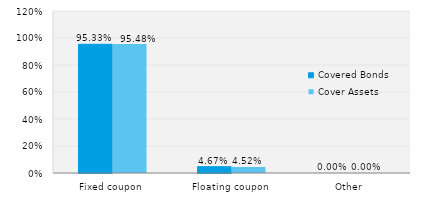
| Category | Covered Bonds | Cover Assets |
|---|---|---|
| Fixed coupon | 0.953 | 0.955 |
| Floating coupon | 0.047 | 0.045 |
| Other | 0 | 0 |